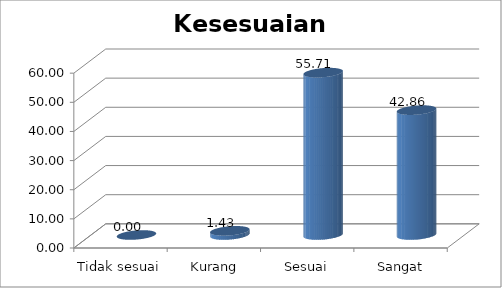
| Category | Kesesuaian Persyaratan |
|---|---|
| Tidak sesuai | 0 |
| Kurang sesuai | 1.429 |
| Sesuai | 55.714 |
| Sangat sesuai | 42.857 |